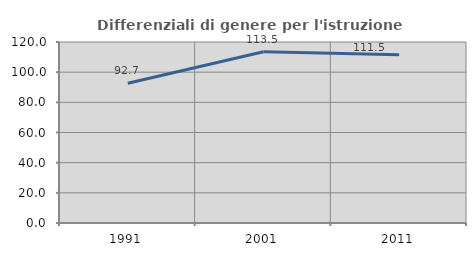
| Category | Differenziali di genere per l'istruzione superiore |
|---|---|
| 1991.0 | 92.707 |
| 2001.0 | 113.49 |
| 2011.0 | 111.485 |